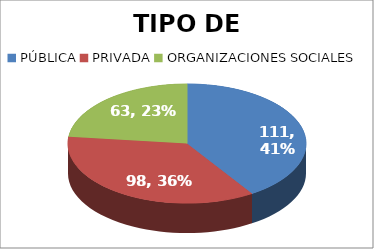
| Category | Series 0 |
|---|---|
| PÚBLICA | 111 |
| PRIVADA | 98 |
| ORGANIZACIONES SOCIALES | 63 |